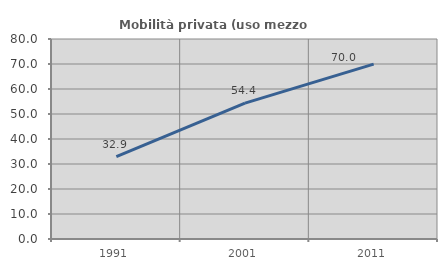
| Category | Mobilità privata (uso mezzo privato) |
|---|---|
| 1991.0 | 32.915 |
| 2001.0 | 54.357 |
| 2011.0 | 69.953 |